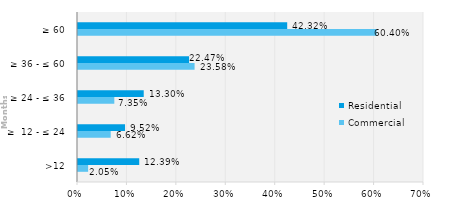
| Category | Commercial | Residential |
|---|---|---|
| >12 | 0.021 | 0.124 |
| ≥  12 - ≤ 24 | 0.066 | 0.095 |
| ≥ 24 - ≤ 36 | 0.073 | 0.133 |
| ≥ 36 - ≤ 60 | 0.236 | 0.225 |
| ≥ 60 | 0.604 | 0.423 |